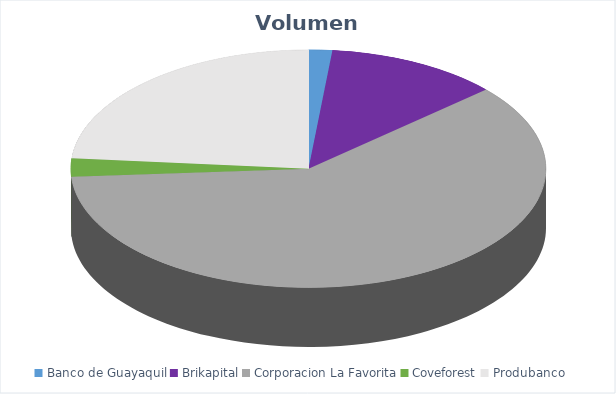
| Category | VOLUMEN ($USD) |
|---|---|
| Banco de Guayaquil | 2588.04 |
| Brikapital | 19000 |
| Corporacion La Favorita | 97474.65 |
| Coveforest | 4004 |
| Produbanco | 38006.65 |